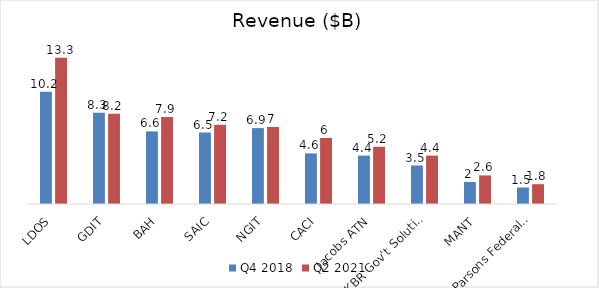
| Category | Q4 2018 | Q2 2021 |
|---|---|---|
| LDOS | 10.2 | 13.3 |
| GDIT | 8.3 | 8.2 |
| BAH | 6.6 | 7.9 |
| SAIC | 6.5 | 7.2 |
| NGIT | 6.9 | 7 |
| CACI | 4.6 | 6 |
| Jacobs ATN | 4.4 | 5.2 |
| KBR Gov't Solution | 3.5 | 4.4 |
| MANT | 2 | 2.6 |
| Parsons Federal Solutions | 1.5 | 1.8 |